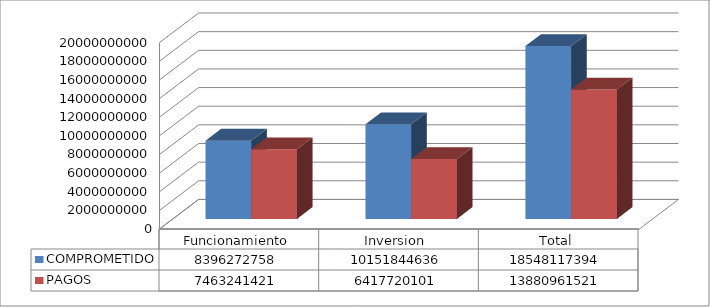
| Category | COMPROMETIDO | PAGOS |
|---|---|---|
| Funcionamiento | 8396272758 | 7463241420.99 |
| Inversion  | 10151844635.58 | 6417720100.5 |
| Total | 18548117393.58 | 13880961521.49 |